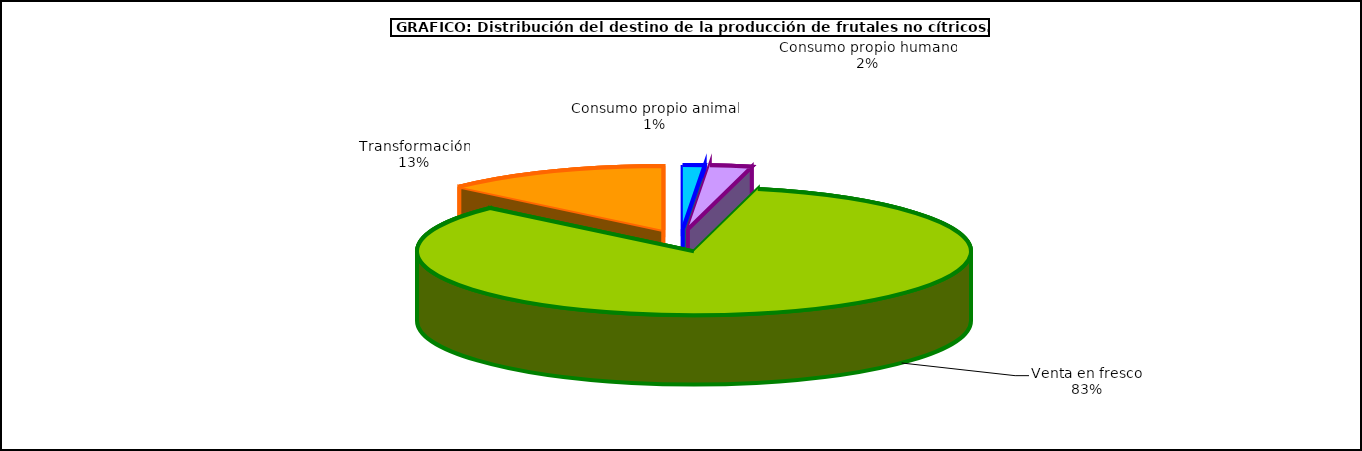
| Category | frutales no cítricos |
|---|---|
| 0 | 60393 |
| 1 | 116996 |
| 2 | 3985081 |
| 3 | 631326 |